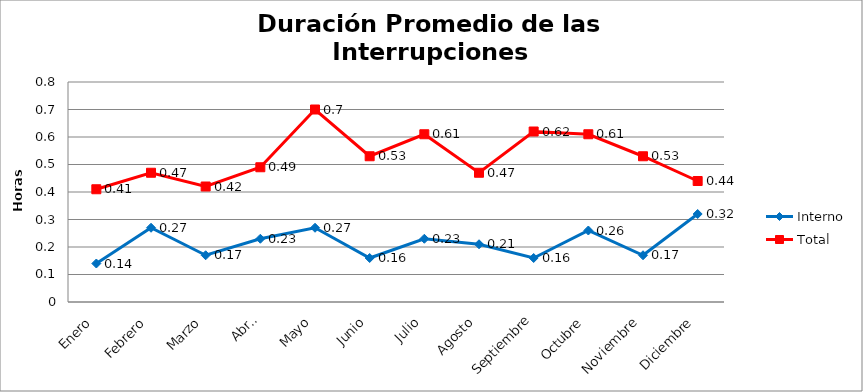
| Category | Interno | Total |
|---|---|---|
| Enero | 0.14 | 0.41 |
| Febrero | 0.27 | 0.47 |
| Marzo | 0.17 | 0.42 |
| Abril | 0.23 | 0.49 |
| Mayo | 0.27 | 0.7 |
| Junio | 0.16 | 0.53 |
| Julio | 0.23 | 0.61 |
| Agosto | 0.21 | 0.47 |
| Septiembre | 0.16 | 0.62 |
| Octubre | 0.26 | 0.61 |
| Noviembre | 0.17 | 0.53 |
| Diciembre | 0.32 | 0.44 |